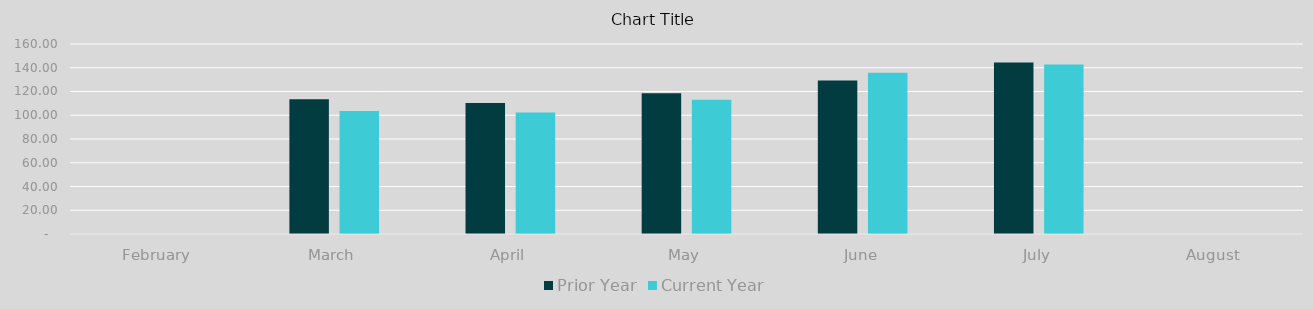
| Category | Prior Year | Current Year |
|---|---|---|
| February | 0 | 0 |
| March | 113.435 | 103.589 |
| April | 110.378 | 102.234 |
| May | 118.45 | 112.97 |
| June | 129.166 | 135.774 |
| July | 144.406 | 142.69 |
| August | 0 | 0 |